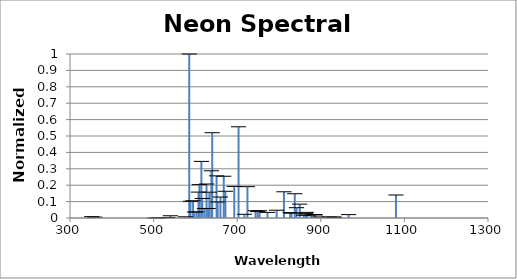
| Category | Normalized Intensity |
|---|---|
| 352.04714 | 0.008 |
| 359.35263 | 0.005 |
| 503.77512 | 0.001 |
| 511.65032 | 0.001 |
| 533.07775 | 0.002 |
| 534.10938 | 0.003 |
| 540.05616 | 0.014 |
| 576.44188 | 0.007 |
| 585.24878 | 1 |
| 588.1895 | 0.102 |
| 594.4834 | 0.105 |
| 597.55343 | 0.036 |
| 602.99968 | 0.038 |
| 607.43376 | 0.158 |
| 609.6163 | 0.203 |
| 614.30627 | 0.345 |
| 616.35937 | 0.119 |
| 621.72812 | 0.058 |
| 626.64952 | 0.207 |
| 630.47893 | 0.058 |
| 633.44276 | 0.157 |
| 638.29914 | 0.288 |
| 640.2248 | 0.52 |
| 650.65277 | 0.257 |
| 653.28824 | 0.098 |
| 659.89528 | 0.128 |
| 667.82766 | 0.255 |
| 671.7043 | 0.163 |
| 692.94672 | 0.193 |
| 703.24128 | 0.556 |
| 717.3938 | 0.023 |
| 724.51665 | 0.191 |
| 743.88981 | 0.045 |
| 748.88712 | 0.039 |
| 753.57739 | 0.044 |
| 772.46233 | 0.034 |
| 794.31805 | 0.047 |
| 811.85495 | 0.16 |
| 826.60769 | 0.033 |
| 830.03248 | 0.029 |
| 837.7607 | 0.148 |
| 841.84265 | 0.063 |
| 849.53591 | 0.085 |
| 859.12583 | 0.017 |
| 863.46472 | 0.027 |
| 865.43828 | 0.034 |
| 868.19216 | 0.018 |
| 885.38669 | 0.021 |
| 886.57562 | 0.018 |
| 891.95007 | 0.006 |
| 920.17588 | 0.006 |
| 930.08532 | 0.006 |
| 932.65072 | 0.005 |
| 966.542 | 0.021 |
| 1079.8043 | 0.14 |